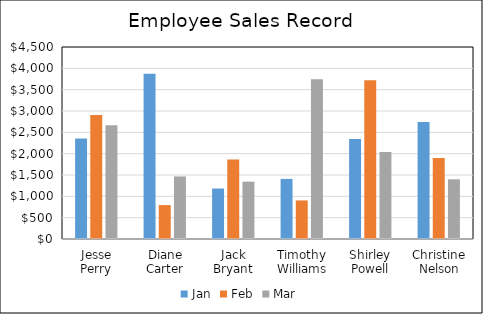
| Category | Jan | Feb | Mar |
|---|---|---|---|
| Jesse Perry | 2353 | 2909 | 2666 |
| Diane Carter | 3872 | 795 | 1466 |
| Jack Bryant | 1183 | 1864 | 1344 |
| Timothy Williams | 1408 | 904 | 3742 |
| Shirley Powell | 2342 | 3721 | 2040 |
| Christine Nelson | 2741 | 1901 | 1399 |